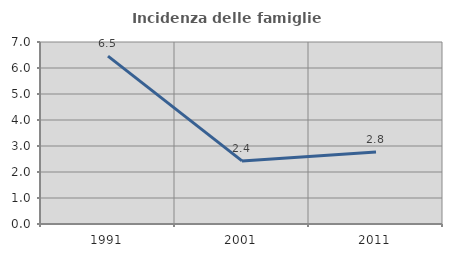
| Category | Incidenza delle famiglie numerose |
|---|---|
| 1991.0 | 6.454 |
| 2001.0 | 2.427 |
| 2011.0 | 2.767 |